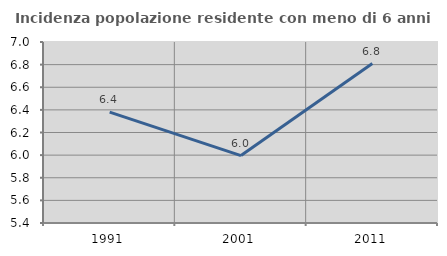
| Category | Incidenza popolazione residente con meno di 6 anni |
|---|---|
| 1991.0 | 6.381 |
| 2001.0 | 5.996 |
| 2011.0 | 6.81 |